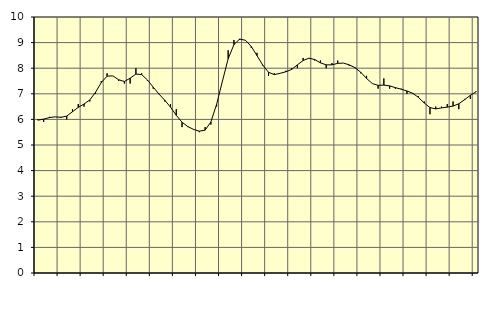
| Category | Piggar | Series 1 |
|---|---|---|
| nan | 6 | 5.97 |
| 1.0 | 5.9 | 6.01 |
| 1.0 | 6.1 | 6.07 |
| 1.0 | 6.1 | 6.1 |
| nan | 6.1 | 6.08 |
| 2.0 | 6 | 6.13 |
| 2.0 | 6.4 | 6.3 |
| 2.0 | 6.6 | 6.47 |
| nan | 6.5 | 6.6 |
| 3.0 | 6.7 | 6.76 |
| 3.0 | 7 | 7.06 |
| 3.0 | 7.5 | 7.44 |
| nan | 7.8 | 7.69 |
| 4.0 | 7.7 | 7.7 |
| 4.0 | 7.5 | 7.55 |
| 4.0 | 7.4 | 7.48 |
| nan | 7.4 | 7.61 |
| 5.0 | 8 | 7.77 |
| 5.0 | 7.8 | 7.75 |
| 5.0 | 7.5 | 7.54 |
| nan | 7.2 | 7.26 |
| 6.0 | 7 | 6.99 |
| 6.0 | 6.7 | 6.75 |
| 6.0 | 6.6 | 6.48 |
| nan | 6.4 | 6.16 |
| 7.0 | 5.7 | 5.89 |
| 7.0 | 5.7 | 5.72 |
| 7.0 | 5.6 | 5.61 |
| nan | 5.5 | 5.54 |
| 8.0 | 5.7 | 5.58 |
| 8.0 | 5.8 | 5.9 |
| 8.0 | 6.5 | 6.59 |
| nan | 7.5 | 7.49 |
| 9.0 | 8.7 | 8.37 |
| 9.0 | 9.1 | 8.92 |
| 9.0 | 9.1 | 9.14 |
| nan | 9.1 | 9.09 |
| 10.0 | 8.8 | 8.85 |
| 10.0 | 8.6 | 8.49 |
| 10.0 | 8.1 | 8.12 |
| nan | 7.7 | 7.84 |
| 11.0 | 7.8 | 7.75 |
| 11.0 | 7.8 | 7.8 |
| 11.0 | 7.9 | 7.86 |
| nan | 8 | 7.95 |
| 12.0 | 8 | 8.13 |
| 12.0 | 8.4 | 8.3 |
| 12.0 | 8.4 | 8.39 |
| nan | 8.3 | 8.34 |
| 13.0 | 8.3 | 8.21 |
| 13.0 | 8 | 8.13 |
| 13.0 | 8.2 | 8.13 |
| nan | 8.3 | 8.19 |
| 14.0 | 8.2 | 8.2 |
| 14.0 | 8.1 | 8.13 |
| 14.0 | 8 | 8.02 |
| nan | 7.8 | 7.84 |
| 15.0 | 7.7 | 7.6 |
| 15.0 | 7.4 | 7.4 |
| 15.0 | 7.2 | 7.33 |
| nan | 7.6 | 7.34 |
| 16.0 | 7.2 | 7.31 |
| 16.0 | 7.2 | 7.24 |
| 16.0 | 7.2 | 7.18 |
| nan | 7 | 7.11 |
| 17.0 | 7 | 7.02 |
| 17.0 | 6.9 | 6.86 |
| 17.0 | 6.7 | 6.64 |
| nan | 6.2 | 6.46 |
| 18.0 | 6.5 | 6.41 |
| 18.0 | 6.5 | 6.45 |
| 18.0 | 6.6 | 6.48 |
| nan | 6.7 | 6.52 |
| 19.0 | 6.4 | 6.61 |
| 19.0 | 6.8 | 6.77 |
| 19.0 | 6.8 | 6.94 |
| nan | 7.1 | 7.08 |